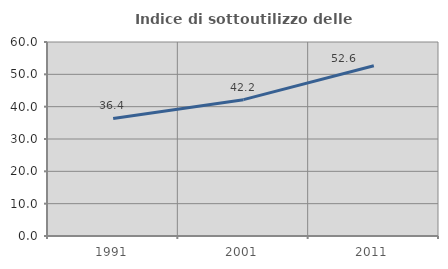
| Category | Indice di sottoutilizzo delle abitazioni  |
|---|---|
| 1991.0 | 36.364 |
| 2001.0 | 42.169 |
| 2011.0 | 52.632 |